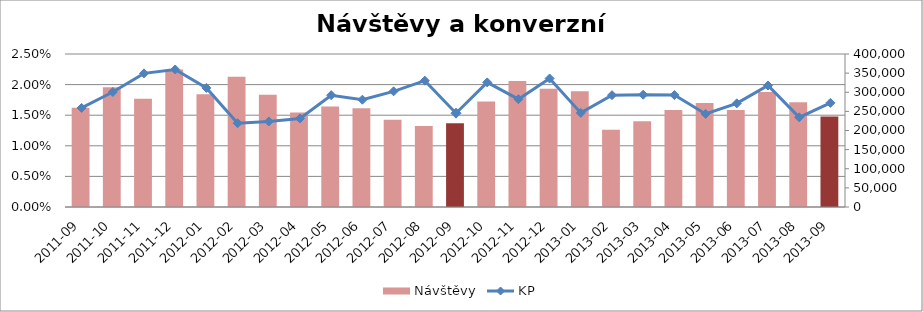
| Category | Návštěvy |
|---|---|
| 2011-09 | 259182.996 |
| 2011-10 | 312937.829 |
| 2011-11 | 282799.204 |
| 2011-12 | 359408.827 |
| 2012-01 | 294964.134 |
| 2012-02 | 340700.168 |
| 2012-03 | 293408.454 |
| 2012-04 | 247288.258 |
| 2012-05 | 262486.259 |
| 2012-06 | 258127.529 |
| 2012-07 | 228412.625 |
| 2012-08 | 211783.961 |
| 2012-09 | 219079.559 |
| 2012-10 | 275706.103 |
| 2012-11 | 329350.952 |
| 2012-12 | 309457.899 |
| 2013-01 | 302334.571 |
| 2013-02 | 202099.709 |
| 2013-03 | 224330.265 |
| 2013-04 | 253551.379 |
| 2013-05 | 272171.626 |
| 2013-06 | 253388.149 |
| 2013-07 | 300977.294 |
| 2013-08 | 273927.203 |
| 2013-09 | 236874.19 |